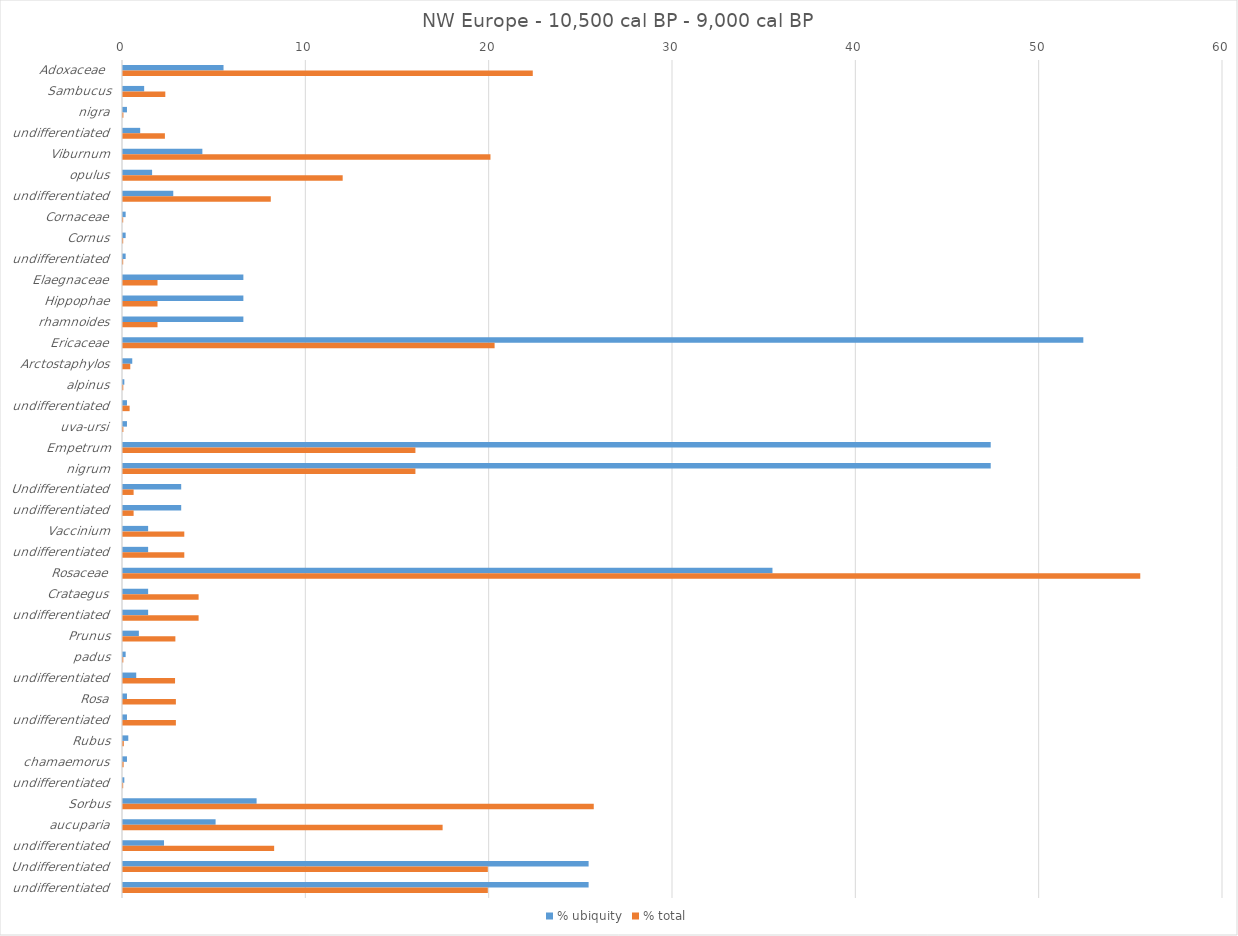
| Category | % ubiquity | % total |
|---|---|---|
| Adoxaceae  | 5.483 | 22.351 |
| Sambucus | 1.154 | 2.308 |
| nigra | 0.216 | 0.022 |
| undifferentiated | 0.938 | 2.286 |
| Viburnum | 4.329 | 20.044 |
| opulus | 1.587 | 11.982 |
| undifferentiated | 2.742 | 8.061 |
| Cornaceae | 0.144 | 0.011 |
| Cornus | 0.144 | 0.011 |
| undifferentiated | 0.144 | 0.011 |
| Elaegnaceae | 6.566 | 1.882 |
| Hippophae | 6.566 | 1.882 |
| rhamnoides | 6.566 | 1.882 |
| Ericaceae | 52.381 | 20.269 |
| Arctostaphylos | 0.505 | 0.397 |
| alpinus | 0.072 | 0.016 |
| undifferentiated | 0.216 | 0.361 |
| uva-ursi | 0.216 | 0.02 |
| Empetrum | 47.33 | 15.95 |
| nigrum | 47.33 | 15.95 |
| Undifferentiated | 3.175 | 0.578 |
| undifferentiated | 3.175 | 0.578 |
| Vaccinium | 1.371 | 3.343 |
| undifferentiated | 1.371 | 3.343 |
| Rosaceae | 35.426 | 55.487 |
| Crataegus | 1.371 | 4.124 |
| undifferentiated | 1.371 | 4.124 |
| Prunus | 0.866 | 2.857 |
| padus | 0.144 | 0.018 |
| undifferentiated | 0.722 | 2.839 |
| Rosa | 0.216 | 2.885 |
| undifferentiated | 0.216 | 2.885 |
| Rubus | 0.289 | 0.044 |
| chamaemorus | 0.216 | 0.034 |
| undifferentiated | 0.072 | 0.01 |
| Sorbus | 7.287 | 25.678 |
| aucuparia | 5.051 | 17.433 |
| undifferentiated | 2.237 | 8.245 |
| Undifferentiated | 25.397 | 19.9 |
| undifferentiated | 25.397 | 19.9 |